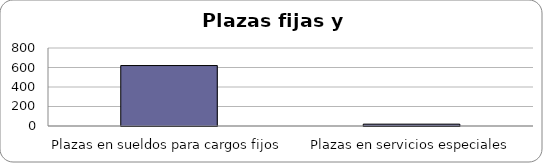
| Category | Series 0 |
|---|---|
| Plazas en sueldos para cargos fijos | 620 |
| Plazas en servicios especiales | 19 |